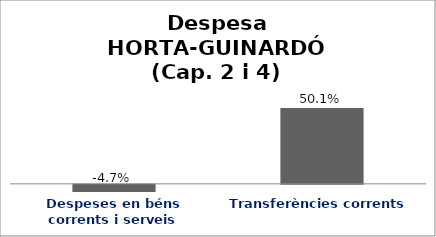
| Category | Series 0 |
|---|---|
| Despeses en béns corrents i serveis | -0.047 |
| Transferències corrents | 0.501 |